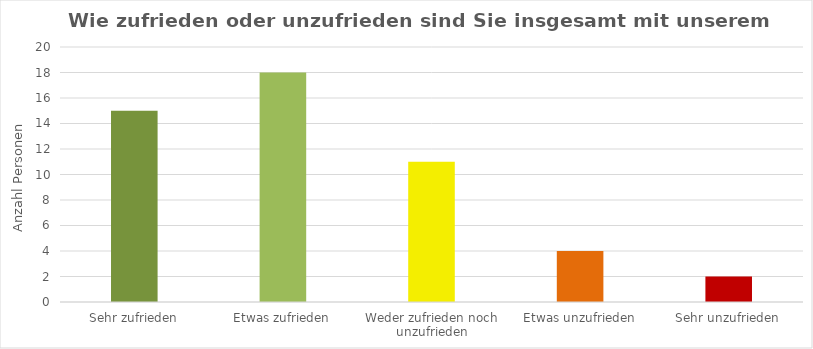
| Category | Series 0 |
|---|---|
| Sehr zufrieden | 15 |
| Etwas zufrieden | 18 |
| Weder zufrieden noch unzufrieden | 11 |
| Etwas unzufrieden | 4 |
| Sehr unzufrieden | 2 |